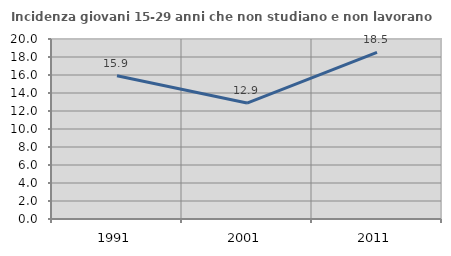
| Category | Incidenza giovani 15-29 anni che non studiano e non lavorano  |
|---|---|
| 1991.0 | 15.915 |
| 2001.0 | 12.885 |
| 2011.0 | 18.519 |